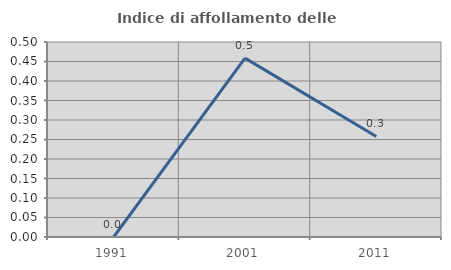
| Category | Indice di affollamento delle abitazioni  |
|---|---|
| 1991.0 | 0 |
| 2001.0 | 0.459 |
| 2011.0 | 0.258 |